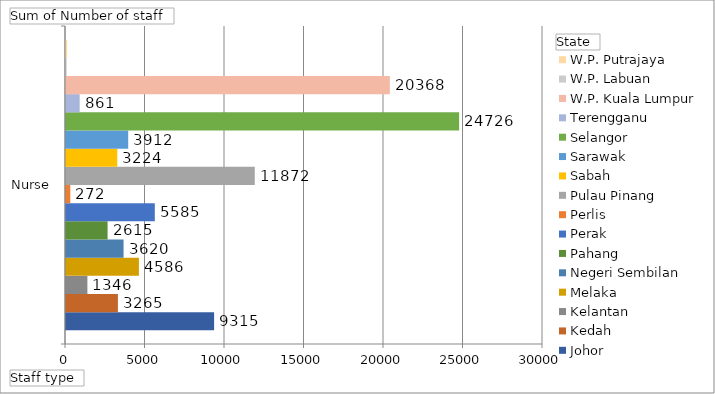
| Category | Johor | Kedah | Kelantan | Melaka | Negeri Sembilan | Pahang | Perak | Perlis | Pulau Pinang | Sabah | Sarawak | Selangor | Terengganu | W.P. Kuala Lumpur | W.P. Labuan | W.P. Putrajaya |
|---|---|---|---|---|---|---|---|---|---|---|---|---|---|---|---|---|
| Nurse | 9315 | 3265 | 1346 | 4586 | 3620 | 2615 | 5585 | 272 | 11872 | 3224 | 3912 | 24726 | 861 | 20368 | 42 | 74 |